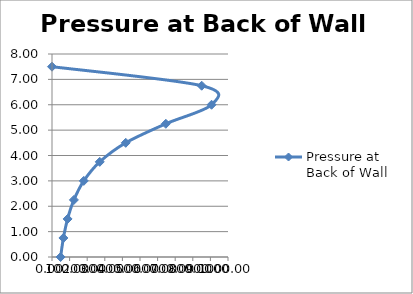
| Category | Pressure at Back of Wall |
|---|---|
| 0.0 | 7.5 |
| 850.5020346411831 | 6.75 |
| 906.4650685205728 | 6 |
| 646.705161845831 | 5.25 |
| 419.0389554921286 | 4.5 |
| 271.3284887993956 | 3.75 |
| 180.63790025253203 | 3 |
| 124.40457758345283 | 2.25 |
| 88.52197934771215 | 1.5 |
| 64.86601407241766 | 0.75 |
| 48.77160068054596 | 0 |